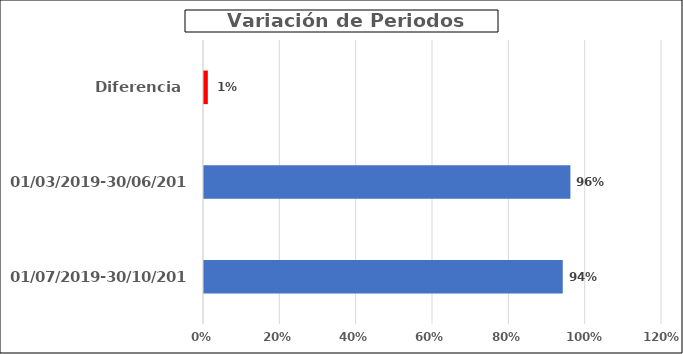
| Category | Calificación Total |
|---|---|
| 01/07/2019-30/10/2019 | 0.94 |
| 01/03/2019-30/06/2019 | 0.96 |
| Diferencia  | 0.01 |